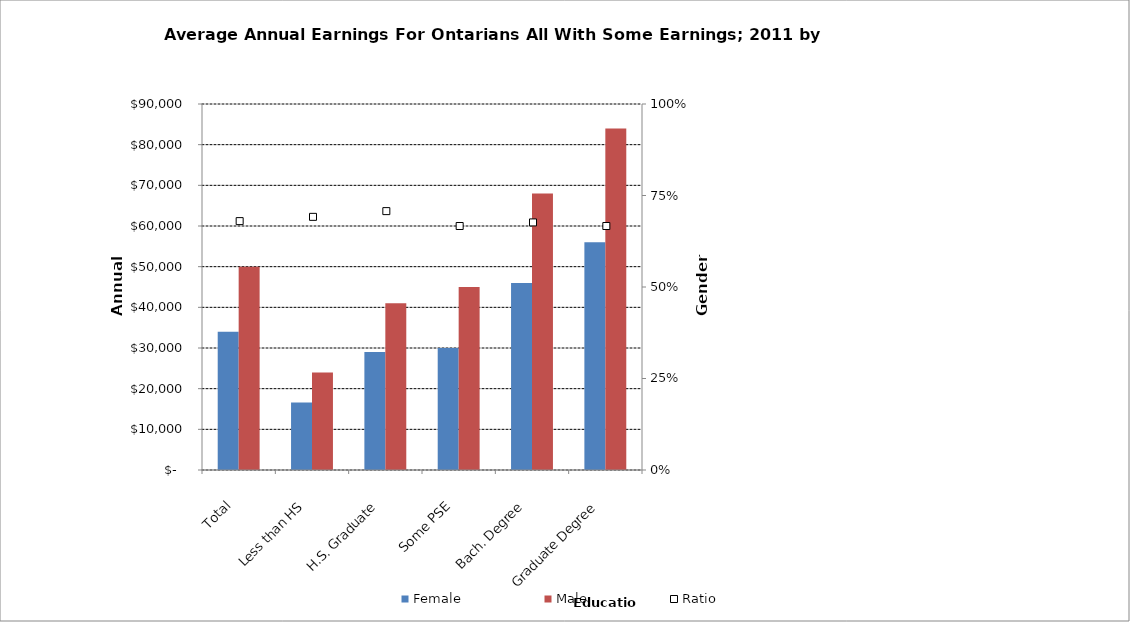
| Category | Female | Male |
|---|---|---|
| Total | 34000 | 50000 |
|  Less than HS  | 16600 | 24000 |
|  H.S. Graduate  | 29000 | 41000 |
|  Some PSE  | 30000 | 45000 |
|  Bach. Degree  | 46000 | 68000 |
|  Graduate Degree  | 56000 | 84000 |